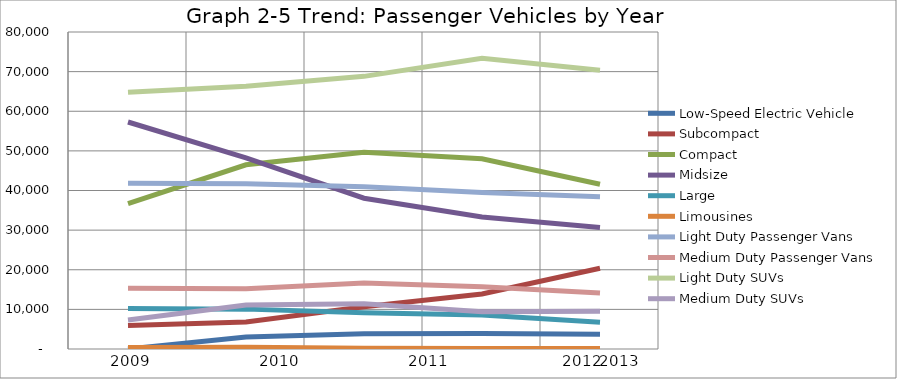
| Category | Low-Speed Electric Vehicle | Subcompact | Compact | Midsize | Large | Limousines | Light Duty Passenger Vans | Medium Duty Passenger Vans | Light Duty SUVs | Medium Duty SUVs |
|---|---|---|---|---|---|---|---|---|---|---|
| 2009.0 | 0 | 5935 | 36662 | 57284 | 10230 | 349 | 41855 | 15362 | 64793 | 7344 |
| 2010.0 | 3029 | 6797 | 46489 | 48242 | 10063 | 412 | 41676 | 15218 | 66316 | 11117 |
| 2011.0 | 3869 | 10658 | 49657 | 38057 | 9146 | 158 | 40964 | 16633 | 68807 | 11448 |
| 2012.0 | 3893 | 13867 | 47999 | 33321 | 8571 | 130 | 39518 | 15740 | 73356 | 9405 |
| 2013.0 | 3729 | 20368 | 41564 | 30659 | 6753 | 123 | 38409 | 14115 | 70371 | 9533 |